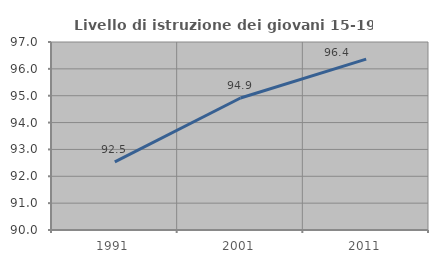
| Category | Livello di istruzione dei giovani 15-19 anni |
|---|---|
| 1991.0 | 92.537 |
| 2001.0 | 94.915 |
| 2011.0 | 96.364 |